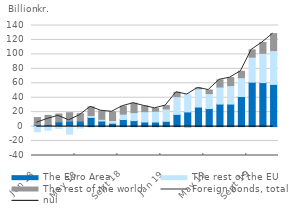
| Category | The Euro Area | The rest of the EU | The rest of the world | Series 0 |
|---|---|---|---|---|
| 2018-01-01 | 2.27 | -7.16 | 10.24 |  |
| 2018-02-01 | 2.76 | -4.92 | 12.8 |  |
| 2018-03-01 | 6.64 | -2.57 | 10.85 |  |
| 2018-04-01 | 7.56 | -10.54 | 11.69 |  |
| 2018-05-01 | 7.55 | -2.12 | 10.36 |  |
| 2018-06-01 | 12.73 | 2.62 | 11.97 |  |
| 2018-07-01 | 7.78 | 2.31 | 11.8 |  |
| 2018-08-01 | 4.7 | 3.73 | 12.15 |  |
| 2018-09-01 | 9.88 | 7.38 | 11.06 |  |
| 2018-10-01 | 8.31 | 11.09 | 13 |  |
| 2018-11-01 | 6.4 | 14.25 | 7.94 |  |
| 2018-12-01 | 6.34 | 14.85 | 4.15 |  |
| 2019-01-01 | 7.33 | 17.15 | 4.67 |  |
| 2019-02-01 | 16.91 | 24.55 | 6.11 |  |
| 2019-03-01 | 20.35 | 24.45 | -0.38 |  |
| 2019-04-01 | 27.1 | 25.42 | 1.08 |  |
| 2019-05-01 | 25.02 | 20.7 | 4.94 |  |
| 2019-06-01 | 31.24 | 23.54 | 9.92 |  |
| 2019-07-01 | 31.2 | 25.52 | 11.14 |  |
| 2019-08-01 | 41.63 | 26.09 | 8.89 |  |
| 2019-09-01 | 61.55 | 34.63 | 10.08 |  |
| 2019-10-01 | 60.93 | 40.55 | 14.94 |  |
| 2019-11-01 | 58.44 | 46.79 | 23.51 |  |